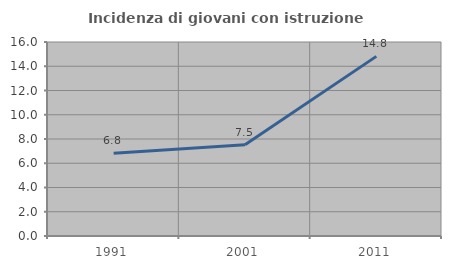
| Category | Incidenza di giovani con istruzione universitaria |
|---|---|
| 1991.0 | 6.818 |
| 2001.0 | 7.527 |
| 2011.0 | 14.815 |